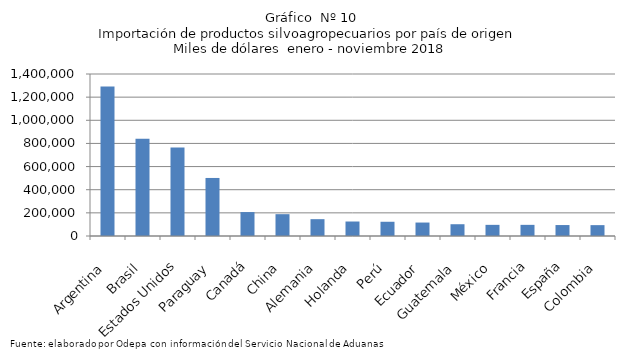
| Category | Series 0 |
|---|---|
| Argentina | 1291817.271 |
| Brasil | 840858.632 |
| Estados Unidos | 765841.161 |
| Paraguay | 501557.399 |
| Canadá | 206916.101 |
| China | 188606.259 |
| Alemania | 145442.129 |
| Holanda | 125243.052 |
| Perú | 122993.279 |
| Ecuador | 116260.234 |
| Guatemala | 101742.059 |
| México | 96347.695 |
| Francia | 96337.321 |
| España | 94634.468 |
| Colombia | 93933.358 |